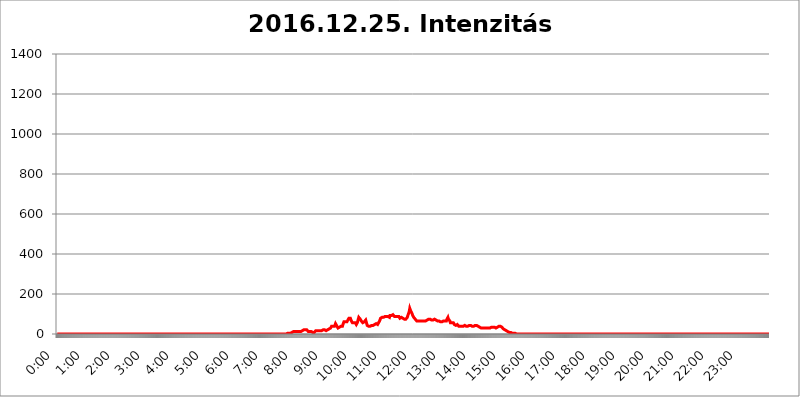
| Category | 2016.12.25. Intenzitás [W/m^2] |
|---|---|
| 0.0 | 0 |
| 0.0006944444444444445 | 0 |
| 0.001388888888888889 | 0 |
| 0.0020833333333333333 | 0 |
| 0.002777777777777778 | 0 |
| 0.003472222222222222 | 0 |
| 0.004166666666666667 | 0 |
| 0.004861111111111111 | 0 |
| 0.005555555555555556 | 0 |
| 0.0062499999999999995 | 0 |
| 0.006944444444444444 | 0 |
| 0.007638888888888889 | 0 |
| 0.008333333333333333 | 0 |
| 0.009027777777777779 | 0 |
| 0.009722222222222222 | 0 |
| 0.010416666666666666 | 0 |
| 0.011111111111111112 | 0 |
| 0.011805555555555555 | 0 |
| 0.012499999999999999 | 0 |
| 0.013194444444444444 | 0 |
| 0.013888888888888888 | 0 |
| 0.014583333333333332 | 0 |
| 0.015277777777777777 | 0 |
| 0.015972222222222224 | 0 |
| 0.016666666666666666 | 0 |
| 0.017361111111111112 | 0 |
| 0.018055555555555557 | 0 |
| 0.01875 | 0 |
| 0.019444444444444445 | 0 |
| 0.02013888888888889 | 0 |
| 0.020833333333333332 | 0 |
| 0.02152777777777778 | 0 |
| 0.022222222222222223 | 0 |
| 0.02291666666666667 | 0 |
| 0.02361111111111111 | 0 |
| 0.024305555555555556 | 0 |
| 0.024999999999999998 | 0 |
| 0.025694444444444447 | 0 |
| 0.02638888888888889 | 0 |
| 0.027083333333333334 | 0 |
| 0.027777777777777776 | 0 |
| 0.02847222222222222 | 0 |
| 0.029166666666666664 | 0 |
| 0.029861111111111113 | 0 |
| 0.030555555555555555 | 0 |
| 0.03125 | 0 |
| 0.03194444444444445 | 0 |
| 0.03263888888888889 | 0 |
| 0.03333333333333333 | 0 |
| 0.034027777777777775 | 0 |
| 0.034722222222222224 | 0 |
| 0.035416666666666666 | 0 |
| 0.036111111111111115 | 0 |
| 0.03680555555555556 | 0 |
| 0.0375 | 0 |
| 0.03819444444444444 | 0 |
| 0.03888888888888889 | 0 |
| 0.03958333333333333 | 0 |
| 0.04027777777777778 | 0 |
| 0.04097222222222222 | 0 |
| 0.041666666666666664 | 0 |
| 0.042361111111111106 | 0 |
| 0.04305555555555556 | 0 |
| 0.043750000000000004 | 0 |
| 0.044444444444444446 | 0 |
| 0.04513888888888889 | 0 |
| 0.04583333333333334 | 0 |
| 0.04652777777777778 | 0 |
| 0.04722222222222222 | 0 |
| 0.04791666666666666 | 0 |
| 0.04861111111111111 | 0 |
| 0.049305555555555554 | 0 |
| 0.049999999999999996 | 0 |
| 0.05069444444444445 | 0 |
| 0.051388888888888894 | 0 |
| 0.052083333333333336 | 0 |
| 0.05277777777777778 | 0 |
| 0.05347222222222222 | 0 |
| 0.05416666666666667 | 0 |
| 0.05486111111111111 | 0 |
| 0.05555555555555555 | 0 |
| 0.05625 | 0 |
| 0.05694444444444444 | 0 |
| 0.057638888888888885 | 0 |
| 0.05833333333333333 | 0 |
| 0.05902777777777778 | 0 |
| 0.059722222222222225 | 0 |
| 0.06041666666666667 | 0 |
| 0.061111111111111116 | 0 |
| 0.06180555555555556 | 0 |
| 0.0625 | 0 |
| 0.06319444444444444 | 0 |
| 0.06388888888888888 | 0 |
| 0.06458333333333334 | 0 |
| 0.06527777777777778 | 0 |
| 0.06597222222222222 | 0 |
| 0.06666666666666667 | 0 |
| 0.06736111111111111 | 0 |
| 0.06805555555555555 | 0 |
| 0.06874999999999999 | 0 |
| 0.06944444444444443 | 0 |
| 0.07013888888888889 | 0 |
| 0.07083333333333333 | 0 |
| 0.07152777777777779 | 0 |
| 0.07222222222222223 | 0 |
| 0.07291666666666667 | 0 |
| 0.07361111111111111 | 0 |
| 0.07430555555555556 | 0 |
| 0.075 | 0 |
| 0.07569444444444444 | 0 |
| 0.0763888888888889 | 0 |
| 0.07708333333333334 | 0 |
| 0.07777777777777778 | 0 |
| 0.07847222222222222 | 0 |
| 0.07916666666666666 | 0 |
| 0.0798611111111111 | 0 |
| 0.08055555555555556 | 0 |
| 0.08125 | 0 |
| 0.08194444444444444 | 0 |
| 0.08263888888888889 | 0 |
| 0.08333333333333333 | 0 |
| 0.08402777777777777 | 0 |
| 0.08472222222222221 | 0 |
| 0.08541666666666665 | 0 |
| 0.08611111111111112 | 0 |
| 0.08680555555555557 | 0 |
| 0.08750000000000001 | 0 |
| 0.08819444444444445 | 0 |
| 0.08888888888888889 | 0 |
| 0.08958333333333333 | 0 |
| 0.09027777777777778 | 0 |
| 0.09097222222222222 | 0 |
| 0.09166666666666667 | 0 |
| 0.09236111111111112 | 0 |
| 0.09305555555555556 | 0 |
| 0.09375 | 0 |
| 0.09444444444444444 | 0 |
| 0.09513888888888888 | 0 |
| 0.09583333333333333 | 0 |
| 0.09652777777777777 | 0 |
| 0.09722222222222222 | 0 |
| 0.09791666666666667 | 0 |
| 0.09861111111111111 | 0 |
| 0.09930555555555555 | 0 |
| 0.09999999999999999 | 0 |
| 0.10069444444444443 | 0 |
| 0.1013888888888889 | 0 |
| 0.10208333333333335 | 0 |
| 0.10277777777777779 | 0 |
| 0.10347222222222223 | 0 |
| 0.10416666666666667 | 0 |
| 0.10486111111111111 | 0 |
| 0.10555555555555556 | 0 |
| 0.10625 | 0 |
| 0.10694444444444444 | 0 |
| 0.1076388888888889 | 0 |
| 0.10833333333333334 | 0 |
| 0.10902777777777778 | 0 |
| 0.10972222222222222 | 0 |
| 0.1111111111111111 | 0 |
| 0.11180555555555556 | 0 |
| 0.11180555555555556 | 0 |
| 0.1125 | 0 |
| 0.11319444444444444 | 0 |
| 0.11388888888888889 | 0 |
| 0.11458333333333333 | 0 |
| 0.11527777777777777 | 0 |
| 0.11597222222222221 | 0 |
| 0.11666666666666665 | 0 |
| 0.1173611111111111 | 0 |
| 0.11805555555555557 | 0 |
| 0.11944444444444445 | 0 |
| 0.12013888888888889 | 0 |
| 0.12083333333333333 | 0 |
| 0.12152777777777778 | 0 |
| 0.12222222222222223 | 0 |
| 0.12291666666666667 | 0 |
| 0.12291666666666667 | 0 |
| 0.12361111111111112 | 0 |
| 0.12430555555555556 | 0 |
| 0.125 | 0 |
| 0.12569444444444444 | 0 |
| 0.12638888888888888 | 0 |
| 0.12708333333333333 | 0 |
| 0.16875 | 0 |
| 0.12847222222222224 | 0 |
| 0.12916666666666668 | 0 |
| 0.12986111111111112 | 0 |
| 0.13055555555555556 | 0 |
| 0.13125 | 0 |
| 0.13194444444444445 | 0 |
| 0.1326388888888889 | 0 |
| 0.13333333333333333 | 0 |
| 0.13402777777777777 | 0 |
| 0.13402777777777777 | 0 |
| 0.13472222222222222 | 0 |
| 0.13541666666666666 | 0 |
| 0.1361111111111111 | 0 |
| 0.13749999999999998 | 0 |
| 0.13819444444444443 | 0 |
| 0.1388888888888889 | 0 |
| 0.13958333333333334 | 0 |
| 0.14027777777777778 | 0 |
| 0.14097222222222222 | 0 |
| 0.14166666666666666 | 0 |
| 0.1423611111111111 | 0 |
| 0.14305555555555557 | 0 |
| 0.14375000000000002 | 0 |
| 0.14444444444444446 | 0 |
| 0.1451388888888889 | 0 |
| 0.1451388888888889 | 0 |
| 0.14652777777777778 | 0 |
| 0.14722222222222223 | 0 |
| 0.14791666666666667 | 0 |
| 0.1486111111111111 | 0 |
| 0.14930555555555555 | 0 |
| 0.15 | 0 |
| 0.15069444444444444 | 0 |
| 0.15138888888888888 | 0 |
| 0.15208333333333332 | 0 |
| 0.15277777777777776 | 0 |
| 0.15347222222222223 | 0 |
| 0.15416666666666667 | 0 |
| 0.15486111111111112 | 0 |
| 0.15555555555555556 | 0 |
| 0.15625 | 0 |
| 0.15694444444444444 | 0 |
| 0.15763888888888888 | 0 |
| 0.15833333333333333 | 0 |
| 0.15902777777777777 | 0 |
| 0.15972222222222224 | 0 |
| 0.16041666666666668 | 0 |
| 0.16111111111111112 | 0 |
| 0.16180555555555556 | 0 |
| 0.1625 | 0 |
| 0.16319444444444445 | 0 |
| 0.1638888888888889 | 0 |
| 0.16458333333333333 | 0 |
| 0.16527777777777777 | 0 |
| 0.16597222222222222 | 0 |
| 0.16666666666666666 | 0 |
| 0.1673611111111111 | 0 |
| 0.16805555555555554 | 0 |
| 0.16874999999999998 | 0 |
| 0.16944444444444443 | 0 |
| 0.17013888888888887 | 0 |
| 0.1708333333333333 | 0 |
| 0.17152777777777775 | 0 |
| 0.17222222222222225 | 0 |
| 0.1729166666666667 | 0 |
| 0.17361111111111113 | 0 |
| 0.17430555555555557 | 0 |
| 0.17500000000000002 | 0 |
| 0.17569444444444446 | 0 |
| 0.1763888888888889 | 0 |
| 0.17708333333333334 | 0 |
| 0.17777777777777778 | 0 |
| 0.17847222222222223 | 0 |
| 0.17916666666666667 | 0 |
| 0.1798611111111111 | 0 |
| 0.18055555555555555 | 0 |
| 0.18125 | 0 |
| 0.18194444444444444 | 0 |
| 0.1826388888888889 | 0 |
| 0.18333333333333335 | 0 |
| 0.1840277777777778 | 0 |
| 0.18472222222222223 | 0 |
| 0.18541666666666667 | 0 |
| 0.18611111111111112 | 0 |
| 0.18680555555555556 | 0 |
| 0.1875 | 0 |
| 0.18819444444444444 | 0 |
| 0.18888888888888888 | 0 |
| 0.18958333333333333 | 0 |
| 0.19027777777777777 | 0 |
| 0.1909722222222222 | 0 |
| 0.19166666666666665 | 0 |
| 0.19236111111111112 | 0 |
| 0.19305555555555554 | 0 |
| 0.19375 | 0 |
| 0.19444444444444445 | 0 |
| 0.1951388888888889 | 0 |
| 0.19583333333333333 | 0 |
| 0.19652777777777777 | 0 |
| 0.19722222222222222 | 0 |
| 0.19791666666666666 | 0 |
| 0.1986111111111111 | 0 |
| 0.19930555555555554 | 0 |
| 0.19999999999999998 | 0 |
| 0.20069444444444443 | 0 |
| 0.20138888888888887 | 0 |
| 0.2020833333333333 | 0 |
| 0.2027777777777778 | 0 |
| 0.2034722222222222 | 0 |
| 0.2041666666666667 | 0 |
| 0.20486111111111113 | 0 |
| 0.20555555555555557 | 0 |
| 0.20625000000000002 | 0 |
| 0.20694444444444446 | 0 |
| 0.2076388888888889 | 0 |
| 0.20833333333333334 | 0 |
| 0.20902777777777778 | 0 |
| 0.20972222222222223 | 0 |
| 0.21041666666666667 | 0 |
| 0.2111111111111111 | 0 |
| 0.21180555555555555 | 0 |
| 0.2125 | 0 |
| 0.21319444444444444 | 0 |
| 0.2138888888888889 | 0 |
| 0.21458333333333335 | 0 |
| 0.2152777777777778 | 0 |
| 0.21597222222222223 | 0 |
| 0.21666666666666667 | 0 |
| 0.21736111111111112 | 0 |
| 0.21805555555555556 | 0 |
| 0.21875 | 0 |
| 0.21944444444444444 | 0 |
| 0.22013888888888888 | 0 |
| 0.22083333333333333 | 0 |
| 0.22152777777777777 | 0 |
| 0.2222222222222222 | 0 |
| 0.22291666666666665 | 0 |
| 0.2236111111111111 | 0 |
| 0.22430555555555556 | 0 |
| 0.225 | 0 |
| 0.22569444444444445 | 0 |
| 0.2263888888888889 | 0 |
| 0.22708333333333333 | 0 |
| 0.22777777777777777 | 0 |
| 0.22847222222222222 | 0 |
| 0.22916666666666666 | 0 |
| 0.2298611111111111 | 0 |
| 0.23055555555555554 | 0 |
| 0.23124999999999998 | 0 |
| 0.23194444444444443 | 0 |
| 0.23263888888888887 | 0 |
| 0.2333333333333333 | 0 |
| 0.2340277777777778 | 0 |
| 0.2347222222222222 | 0 |
| 0.2354166666666667 | 0 |
| 0.23611111111111113 | 0 |
| 0.23680555555555557 | 0 |
| 0.23750000000000002 | 0 |
| 0.23819444444444446 | 0 |
| 0.2388888888888889 | 0 |
| 0.23958333333333334 | 0 |
| 0.24027777777777778 | 0 |
| 0.24097222222222223 | 0 |
| 0.24166666666666667 | 0 |
| 0.2423611111111111 | 0 |
| 0.24305555555555555 | 0 |
| 0.24375 | 0 |
| 0.24444444444444446 | 0 |
| 0.24513888888888888 | 0 |
| 0.24583333333333335 | 0 |
| 0.2465277777777778 | 0 |
| 0.24722222222222223 | 0 |
| 0.24791666666666667 | 0 |
| 0.24861111111111112 | 0 |
| 0.24930555555555556 | 0 |
| 0.25 | 0 |
| 0.25069444444444444 | 0 |
| 0.2513888888888889 | 0 |
| 0.2520833333333333 | 0 |
| 0.25277777777777777 | 0 |
| 0.2534722222222222 | 0 |
| 0.25416666666666665 | 0 |
| 0.2548611111111111 | 0 |
| 0.2555555555555556 | 0 |
| 0.25625000000000003 | 0 |
| 0.2569444444444445 | 0 |
| 0.2576388888888889 | 0 |
| 0.25833333333333336 | 0 |
| 0.2590277777777778 | 0 |
| 0.25972222222222224 | 0 |
| 0.2604166666666667 | 0 |
| 0.2611111111111111 | 0 |
| 0.26180555555555557 | 0 |
| 0.2625 | 0 |
| 0.26319444444444445 | 0 |
| 0.2638888888888889 | 0 |
| 0.26458333333333334 | 0 |
| 0.2652777777777778 | 0 |
| 0.2659722222222222 | 0 |
| 0.26666666666666666 | 0 |
| 0.2673611111111111 | 0 |
| 0.26805555555555555 | 0 |
| 0.26875 | 0 |
| 0.26944444444444443 | 0 |
| 0.2701388888888889 | 0 |
| 0.2708333333333333 | 0 |
| 0.27152777777777776 | 0 |
| 0.2722222222222222 | 0 |
| 0.27291666666666664 | 0 |
| 0.2736111111111111 | 0 |
| 0.2743055555555555 | 0 |
| 0.27499999999999997 | 0 |
| 0.27569444444444446 | 0 |
| 0.27638888888888885 | 0 |
| 0.27708333333333335 | 0 |
| 0.2777777777777778 | 0 |
| 0.27847222222222223 | 0 |
| 0.2791666666666667 | 0 |
| 0.2798611111111111 | 0 |
| 0.28055555555555556 | 0 |
| 0.28125 | 0 |
| 0.28194444444444444 | 0 |
| 0.2826388888888889 | 0 |
| 0.2833333333333333 | 0 |
| 0.28402777777777777 | 0 |
| 0.2847222222222222 | 0 |
| 0.28541666666666665 | 0 |
| 0.28611111111111115 | 0 |
| 0.28680555555555554 | 0 |
| 0.28750000000000003 | 0 |
| 0.2881944444444445 | 0 |
| 0.2888888888888889 | 0 |
| 0.28958333333333336 | 0 |
| 0.2902777777777778 | 0 |
| 0.29097222222222224 | 0 |
| 0.2916666666666667 | 0 |
| 0.2923611111111111 | 0 |
| 0.29305555555555557 | 0 |
| 0.29375 | 0 |
| 0.29444444444444445 | 0 |
| 0.2951388888888889 | 0 |
| 0.29583333333333334 | 0 |
| 0.2965277777777778 | 0 |
| 0.2972222222222222 | 0 |
| 0.29791666666666666 | 0 |
| 0.2986111111111111 | 0 |
| 0.29930555555555555 | 0 |
| 0.3 | 0 |
| 0.30069444444444443 | 0 |
| 0.3013888888888889 | 0 |
| 0.3020833333333333 | 0 |
| 0.30277777777777776 | 0 |
| 0.3034722222222222 | 0 |
| 0.30416666666666664 | 0 |
| 0.3048611111111111 | 0 |
| 0.3055555555555555 | 0 |
| 0.30624999999999997 | 0 |
| 0.3069444444444444 | 0 |
| 0.3076388888888889 | 0 |
| 0.30833333333333335 | 0 |
| 0.3090277777777778 | 0 |
| 0.30972222222222223 | 0 |
| 0.3104166666666667 | 0 |
| 0.3111111111111111 | 0 |
| 0.31180555555555556 | 0 |
| 0.3125 | 0 |
| 0.31319444444444444 | 0 |
| 0.3138888888888889 | 0 |
| 0.3145833333333333 | 0 |
| 0.31527777777777777 | 0 |
| 0.3159722222222222 | 0 |
| 0.31666666666666665 | 0 |
| 0.31736111111111115 | 0 |
| 0.31805555555555554 | 0 |
| 0.31875000000000003 | 0 |
| 0.3194444444444445 | 0 |
| 0.3201388888888889 | 0 |
| 0.32083333333333336 | 0 |
| 0.3215277777777778 | 3.525 |
| 0.32222222222222224 | 3.525 |
| 0.3229166666666667 | 3.525 |
| 0.3236111111111111 | 3.525 |
| 0.32430555555555557 | 3.525 |
| 0.325 | 3.525 |
| 0.32569444444444445 | 3.525 |
| 0.3263888888888889 | 3.525 |
| 0.32708333333333334 | 3.525 |
| 0.3277777777777778 | 7.887 |
| 0.3284722222222222 | 7.887 |
| 0.32916666666666666 | 7.887 |
| 0.3298611111111111 | 7.887 |
| 0.33055555555555555 | 7.887 |
| 0.33125 | 12.257 |
| 0.33194444444444443 | 12.257 |
| 0.3326388888888889 | 12.257 |
| 0.3333333333333333 | 12.257 |
| 0.3340277777777778 | 12.257 |
| 0.3347222222222222 | 12.257 |
| 0.3354166666666667 | 12.257 |
| 0.3361111111111111 | 12.257 |
| 0.3368055555555556 | 12.257 |
| 0.33749999999999997 | 12.257 |
| 0.33819444444444446 | 12.257 |
| 0.33888888888888885 | 12.257 |
| 0.33958333333333335 | 12.257 |
| 0.34027777777777773 | 12.257 |
| 0.34097222222222223 | 12.257 |
| 0.3416666666666666 | 12.257 |
| 0.3423611111111111 | 16.636 |
| 0.3430555555555555 | 16.636 |
| 0.34375 | 16.636 |
| 0.3444444444444445 | 16.636 |
| 0.3451388888888889 | 16.636 |
| 0.3458333333333334 | 21.024 |
| 0.34652777777777777 | 21.024 |
| 0.34722222222222227 | 21.024 |
| 0.34791666666666665 | 21.024 |
| 0.34861111111111115 | 21.024 |
| 0.34930555555555554 | 21.024 |
| 0.35000000000000003 | 21.024 |
| 0.3506944444444444 | 21.024 |
| 0.3513888888888889 | 16.636 |
| 0.3520833333333333 | 12.257 |
| 0.3527777777777778 | 12.257 |
| 0.3534722222222222 | 12.257 |
| 0.3541666666666667 | 12.257 |
| 0.3548611111111111 | 12.257 |
| 0.35555555555555557 | 12.257 |
| 0.35625 | 12.257 |
| 0.35694444444444445 | 12.257 |
| 0.3576388888888889 | 12.257 |
| 0.35833333333333334 | 7.887 |
| 0.3590277777777778 | 7.887 |
| 0.3597222222222222 | 7.887 |
| 0.36041666666666666 | 7.887 |
| 0.3611111111111111 | 12.257 |
| 0.36180555555555555 | 12.257 |
| 0.3625 | 16.636 |
| 0.36319444444444443 | 16.636 |
| 0.3638888888888889 | 16.636 |
| 0.3645833333333333 | 16.636 |
| 0.3652777777777778 | 16.636 |
| 0.3659722222222222 | 16.636 |
| 0.3666666666666667 | 16.636 |
| 0.3673611111111111 | 16.636 |
| 0.3680555555555556 | 16.636 |
| 0.36874999999999997 | 16.636 |
| 0.36944444444444446 | 16.636 |
| 0.37013888888888885 | 16.636 |
| 0.37083333333333335 | 16.636 |
| 0.37152777777777773 | 21.024 |
| 0.37222222222222223 | 21.024 |
| 0.3729166666666666 | 21.024 |
| 0.3736111111111111 | 16.636 |
| 0.3743055555555555 | 21.024 |
| 0.375 | 21.024 |
| 0.3756944444444445 | 16.636 |
| 0.3763888888888889 | 21.024 |
| 0.3770833333333334 | 16.636 |
| 0.37777777777777777 | 16.636 |
| 0.37847222222222227 | 21.024 |
| 0.37916666666666665 | 21.024 |
| 0.37986111111111115 | 25.419 |
| 0.38055555555555554 | 25.419 |
| 0.38125000000000003 | 25.419 |
| 0.3819444444444444 | 29.823 |
| 0.3826388888888889 | 29.823 |
| 0.3833333333333333 | 29.823 |
| 0.3840277777777778 | 34.234 |
| 0.3847222222222222 | 38.653 |
| 0.3854166666666667 | 43.079 |
| 0.3861111111111111 | 38.653 |
| 0.38680555555555557 | 38.653 |
| 0.3875 | 34.234 |
| 0.38819444444444445 | 34.234 |
| 0.3888888888888889 | 38.653 |
| 0.38958333333333334 | 43.079 |
| 0.3902777777777778 | 51.951 |
| 0.3909722222222222 | 51.951 |
| 0.39166666666666666 | 47.511 |
| 0.3923611111111111 | 38.653 |
| 0.39305555555555555 | 34.234 |
| 0.39375 | 29.823 |
| 0.39444444444444443 | 29.823 |
| 0.3951388888888889 | 29.823 |
| 0.3958333333333333 | 34.234 |
| 0.3965277777777778 | 38.653 |
| 0.3972222222222222 | 38.653 |
| 0.3979166666666667 | 38.653 |
| 0.3986111111111111 | 38.653 |
| 0.3993055555555556 | 38.653 |
| 0.39999999999999997 | 38.653 |
| 0.40069444444444446 | 47.511 |
| 0.40138888888888885 | 51.951 |
| 0.40208333333333335 | 60.85 |
| 0.40277777777777773 | 65.31 |
| 0.40347222222222223 | 65.31 |
| 0.4041666666666666 | 60.85 |
| 0.4048611111111111 | 60.85 |
| 0.4055555555555555 | 65.31 |
| 0.40625 | 60.85 |
| 0.4069444444444445 | 65.31 |
| 0.4076388888888889 | 69.775 |
| 0.4083333333333334 | 74.246 |
| 0.40902777777777777 | 78.722 |
| 0.40972222222222227 | 78.722 |
| 0.41041666666666665 | 83.205 |
| 0.41111111111111115 | 78.722 |
| 0.41180555555555554 | 78.722 |
| 0.41250000000000003 | 65.31 |
| 0.4131944444444444 | 60.85 |
| 0.4138888888888889 | 56.398 |
| 0.4145833333333333 | 56.398 |
| 0.4152777777777778 | 56.398 |
| 0.4159722222222222 | 56.398 |
| 0.4166666666666667 | 56.398 |
| 0.4173611111111111 | 51.951 |
| 0.41805555555555557 | 56.398 |
| 0.41875 | 51.951 |
| 0.41944444444444445 | 47.511 |
| 0.4201388888888889 | 51.951 |
| 0.42083333333333334 | 56.398 |
| 0.4215277777777778 | 60.85 |
| 0.4222222222222222 | 74.246 |
| 0.42291666666666666 | 83.205 |
| 0.4236111111111111 | 83.205 |
| 0.42430555555555555 | 83.205 |
| 0.425 | 74.246 |
| 0.42569444444444443 | 69.775 |
| 0.4263888888888889 | 65.31 |
| 0.4270833333333333 | 60.85 |
| 0.4277777777777778 | 60.85 |
| 0.4284722222222222 | 56.398 |
| 0.4291666666666667 | 60.85 |
| 0.4298611111111111 | 60.85 |
| 0.4305555555555556 | 60.85 |
| 0.43124999999999997 | 60.85 |
| 0.43194444444444446 | 65.31 |
| 0.43263888888888885 | 69.775 |
| 0.43333333333333335 | 60.85 |
| 0.43402777777777773 | 51.951 |
| 0.43472222222222223 | 43.079 |
| 0.4354166666666666 | 43.079 |
| 0.4361111111111111 | 38.653 |
| 0.4368055555555555 | 38.653 |
| 0.4375 | 38.653 |
| 0.4381944444444445 | 38.653 |
| 0.4388888888888889 | 38.653 |
| 0.4395833333333334 | 38.653 |
| 0.44027777777777777 | 38.653 |
| 0.44097222222222227 | 43.079 |
| 0.44166666666666665 | 43.079 |
| 0.44236111111111115 | 43.079 |
| 0.44305555555555554 | 43.079 |
| 0.44375000000000003 | 43.079 |
| 0.4444444444444444 | 47.511 |
| 0.4451388888888889 | 47.511 |
| 0.4458333333333333 | 51.951 |
| 0.4465277777777778 | 47.511 |
| 0.4472222222222222 | 51.951 |
| 0.4479166666666667 | 47.511 |
| 0.4486111111111111 | 47.511 |
| 0.44930555555555557 | 47.511 |
| 0.45 | 47.511 |
| 0.45069444444444445 | 56.398 |
| 0.4513888888888889 | 60.85 |
| 0.45208333333333334 | 65.31 |
| 0.4527777777777778 | 69.775 |
| 0.4534722222222222 | 78.722 |
| 0.45416666666666666 | 83.205 |
| 0.4548611111111111 | 83.205 |
| 0.45555555555555555 | 83.205 |
| 0.45625 | 78.722 |
| 0.45694444444444443 | 78.722 |
| 0.4576388888888889 | 83.205 |
| 0.4583333333333333 | 83.205 |
| 0.4590277777777778 | 87.692 |
| 0.4597222222222222 | 87.692 |
| 0.4604166666666667 | 87.692 |
| 0.4611111111111111 | 87.692 |
| 0.4618055555555556 | 87.692 |
| 0.46249999999999997 | 87.692 |
| 0.46319444444444446 | 87.692 |
| 0.46388888888888885 | 87.692 |
| 0.46458333333333335 | 83.205 |
| 0.46527777777777773 | 83.205 |
| 0.46597222222222223 | 83.205 |
| 0.4666666666666666 | 92.184 |
| 0.4673611111111111 | 92.184 |
| 0.4680555555555555 | 92.184 |
| 0.46875 | 92.184 |
| 0.4694444444444445 | 92.184 |
| 0.4701388888888889 | 96.682 |
| 0.4708333333333334 | 96.682 |
| 0.47152777777777777 | 92.184 |
| 0.47222222222222227 | 92.184 |
| 0.47291666666666665 | 87.692 |
| 0.47361111111111115 | 87.692 |
| 0.47430555555555554 | 87.692 |
| 0.47500000000000003 | 87.692 |
| 0.4756944444444444 | 87.692 |
| 0.4763888888888889 | 87.692 |
| 0.4770833333333333 | 87.692 |
| 0.4777777777777778 | 83.205 |
| 0.4784722222222222 | 87.692 |
| 0.4791666666666667 | 87.692 |
| 0.4798611111111111 | 83.205 |
| 0.48055555555555557 | 78.722 |
| 0.48125 | 78.722 |
| 0.48194444444444445 | 83.205 |
| 0.4826388888888889 | 83.205 |
| 0.48333333333333334 | 83.205 |
| 0.4840277777777778 | 78.722 |
| 0.4847222222222222 | 78.722 |
| 0.48541666666666666 | 74.246 |
| 0.4861111111111111 | 74.246 |
| 0.48680555555555555 | 74.246 |
| 0.4875 | 69.775 |
| 0.48819444444444443 | 74.246 |
| 0.4888888888888889 | 74.246 |
| 0.4895833333333333 | 74.246 |
| 0.4902777777777778 | 78.722 |
| 0.4909722222222222 | 83.205 |
| 0.4916666666666667 | 92.184 |
| 0.4923611111111111 | 96.682 |
| 0.4930555555555556 | 105.69 |
| 0.49374999999999997 | 114.716 |
| 0.49444444444444446 | 128.284 |
| 0.49513888888888885 | 123.758 |
| 0.49583333333333335 | 114.716 |
| 0.49652777777777773 | 110.201 |
| 0.49722222222222223 | 105.69 |
| 0.4979166666666666 | 101.184 |
| 0.4986111111111111 | 92.184 |
| 0.4993055555555555 | 87.692 |
| 0.5 | 83.205 |
| 0.5006944444444444 | 83.205 |
| 0.5013888888888889 | 78.722 |
| 0.5020833333333333 | 74.246 |
| 0.5027777777777778 | 74.246 |
| 0.5034722222222222 | 69.775 |
| 0.5041666666666667 | 65.31 |
| 0.5048611111111111 | 65.31 |
| 0.5055555555555555 | 65.31 |
| 0.50625 | 65.31 |
| 0.5069444444444444 | 65.31 |
| 0.5076388888888889 | 65.31 |
| 0.5083333333333333 | 65.31 |
| 0.5090277777777777 | 65.31 |
| 0.5097222222222222 | 65.31 |
| 0.5104166666666666 | 65.31 |
| 0.5111111111111112 | 60.85 |
| 0.5118055555555555 | 65.31 |
| 0.5125000000000001 | 65.31 |
| 0.5131944444444444 | 65.31 |
| 0.513888888888889 | 65.31 |
| 0.5145833333333333 | 65.31 |
| 0.5152777777777778 | 65.31 |
| 0.5159722222222222 | 65.31 |
| 0.5166666666666667 | 65.31 |
| 0.517361111111111 | 65.31 |
| 0.5180555555555556 | 69.775 |
| 0.5187499999999999 | 69.775 |
| 0.5194444444444445 | 69.775 |
| 0.5201388888888888 | 69.775 |
| 0.5208333333333334 | 74.246 |
| 0.5215277777777778 | 74.246 |
| 0.5222222222222223 | 74.246 |
| 0.5229166666666667 | 74.246 |
| 0.5236111111111111 | 74.246 |
| 0.5243055555555556 | 69.775 |
| 0.525 | 69.775 |
| 0.5256944444444445 | 65.31 |
| 0.5263888888888889 | 69.775 |
| 0.5270833333333333 | 69.775 |
| 0.5277777777777778 | 69.775 |
| 0.5284722222222222 | 69.775 |
| 0.5291666666666667 | 74.246 |
| 0.5298611111111111 | 74.246 |
| 0.5305555555555556 | 69.775 |
| 0.53125 | 69.775 |
| 0.5319444444444444 | 69.775 |
| 0.5326388888888889 | 69.775 |
| 0.5333333333333333 | 65.31 |
| 0.5340277777777778 | 65.31 |
| 0.5347222222222222 | 65.31 |
| 0.5354166666666667 | 65.31 |
| 0.5361111111111111 | 60.85 |
| 0.5368055555555555 | 60.85 |
| 0.5375 | 60.85 |
| 0.5381944444444444 | 60.85 |
| 0.5388888888888889 | 60.85 |
| 0.5395833333333333 | 60.85 |
| 0.5402777777777777 | 60.85 |
| 0.5409722222222222 | 65.31 |
| 0.5416666666666666 | 65.31 |
| 0.5423611111111112 | 65.31 |
| 0.5430555555555555 | 65.31 |
| 0.5437500000000001 | 65.31 |
| 0.5444444444444444 | 65.31 |
| 0.545138888888889 | 60.85 |
| 0.5458333333333333 | 65.31 |
| 0.5465277777777778 | 74.246 |
| 0.5472222222222222 | 78.722 |
| 0.5479166666666667 | 83.205 |
| 0.548611111111111 | 74.246 |
| 0.5493055555555556 | 74.246 |
| 0.5499999999999999 | 69.775 |
| 0.5506944444444445 | 65.31 |
| 0.5513888888888888 | 56.398 |
| 0.5520833333333334 | 51.951 |
| 0.5527777777777778 | 51.951 |
| 0.5534722222222223 | 56.398 |
| 0.5541666666666667 | 51.951 |
| 0.5548611111111111 | 56.398 |
| 0.5555555555555556 | 56.398 |
| 0.55625 | 51.951 |
| 0.5569444444444445 | 47.511 |
| 0.5576388888888889 | 47.511 |
| 0.5583333333333333 | 47.511 |
| 0.5590277777777778 | 43.079 |
| 0.5597222222222222 | 47.511 |
| 0.5604166666666667 | 47.511 |
| 0.5611111111111111 | 47.511 |
| 0.5618055555555556 | 47.511 |
| 0.5625 | 43.079 |
| 0.5631944444444444 | 38.653 |
| 0.5638888888888889 | 38.653 |
| 0.5645833333333333 | 38.653 |
| 0.5652777777777778 | 38.653 |
| 0.5659722222222222 | 38.653 |
| 0.5666666666666667 | 38.653 |
| 0.5673611111111111 | 38.653 |
| 0.5680555555555555 | 38.653 |
| 0.56875 | 38.653 |
| 0.5694444444444444 | 38.653 |
| 0.5701388888888889 | 38.653 |
| 0.5708333333333333 | 38.653 |
| 0.5715277777777777 | 43.079 |
| 0.5722222222222222 | 38.653 |
| 0.5729166666666666 | 38.653 |
| 0.5736111111111112 | 38.653 |
| 0.5743055555555555 | 43.079 |
| 0.5750000000000001 | 38.653 |
| 0.5756944444444444 | 38.653 |
| 0.576388888888889 | 43.079 |
| 0.5770833333333333 | 43.079 |
| 0.5777777777777778 | 43.079 |
| 0.5784722222222222 | 43.079 |
| 0.5791666666666667 | 43.079 |
| 0.579861111111111 | 43.079 |
| 0.5805555555555556 | 43.079 |
| 0.5812499999999999 | 43.079 |
| 0.5819444444444445 | 38.653 |
| 0.5826388888888888 | 38.653 |
| 0.5833333333333334 | 38.653 |
| 0.5840277777777778 | 38.653 |
| 0.5847222222222223 | 43.079 |
| 0.5854166666666667 | 43.079 |
| 0.5861111111111111 | 43.079 |
| 0.5868055555555556 | 43.079 |
| 0.5875 | 43.079 |
| 0.5881944444444445 | 43.079 |
| 0.5888888888888889 | 43.079 |
| 0.5895833333333333 | 38.653 |
| 0.5902777777777778 | 38.653 |
| 0.5909722222222222 | 38.653 |
| 0.5916666666666667 | 38.653 |
| 0.5923611111111111 | 34.234 |
| 0.5930555555555556 | 34.234 |
| 0.59375 | 29.823 |
| 0.5944444444444444 | 29.823 |
| 0.5951388888888889 | 29.823 |
| 0.5958333333333333 | 29.823 |
| 0.5965277777777778 | 29.823 |
| 0.5972222222222222 | 29.823 |
| 0.5979166666666667 | 29.823 |
| 0.5986111111111111 | 29.823 |
| 0.5993055555555555 | 29.823 |
| 0.6 | 29.823 |
| 0.6006944444444444 | 29.823 |
| 0.6013888888888889 | 29.823 |
| 0.6020833333333333 | 29.823 |
| 0.6027777777777777 | 29.823 |
| 0.6034722222222222 | 29.823 |
| 0.6041666666666666 | 29.823 |
| 0.6048611111111112 | 29.823 |
| 0.6055555555555555 | 29.823 |
| 0.6062500000000001 | 29.823 |
| 0.6069444444444444 | 29.823 |
| 0.607638888888889 | 29.823 |
| 0.6083333333333333 | 34.234 |
| 0.6090277777777778 | 34.234 |
| 0.6097222222222222 | 34.234 |
| 0.6104166666666667 | 34.234 |
| 0.611111111111111 | 34.234 |
| 0.6118055555555556 | 34.234 |
| 0.6124999999999999 | 34.234 |
| 0.6131944444444445 | 34.234 |
| 0.6138888888888888 | 29.823 |
| 0.6145833333333334 | 29.823 |
| 0.6152777777777778 | 29.823 |
| 0.6159722222222223 | 29.823 |
| 0.6166666666666667 | 34.234 |
| 0.6173611111111111 | 34.234 |
| 0.6180555555555556 | 34.234 |
| 0.61875 | 38.653 |
| 0.6194444444444445 | 38.653 |
| 0.6201388888888889 | 38.653 |
| 0.6208333333333333 | 38.653 |
| 0.6215277777777778 | 38.653 |
| 0.6222222222222222 | 38.653 |
| 0.6229166666666667 | 34.234 |
| 0.6236111111111111 | 34.234 |
| 0.6243055555555556 | 29.823 |
| 0.625 | 29.823 |
| 0.6256944444444444 | 25.419 |
| 0.6263888888888889 | 25.419 |
| 0.6270833333333333 | 21.024 |
| 0.6277777777777778 | 21.024 |
| 0.6284722222222222 | 21.024 |
| 0.6291666666666667 | 16.636 |
| 0.6298611111111111 | 16.636 |
| 0.6305555555555555 | 16.636 |
| 0.63125 | 12.257 |
| 0.6319444444444444 | 12.257 |
| 0.6326388888888889 | 12.257 |
| 0.6333333333333333 | 7.887 |
| 0.6340277777777777 | 7.887 |
| 0.6347222222222222 | 7.887 |
| 0.6354166666666666 | 7.887 |
| 0.6361111111111112 | 7.887 |
| 0.6368055555555555 | 7.887 |
| 0.6375000000000001 | 3.525 |
| 0.6381944444444444 | 3.525 |
| 0.638888888888889 | 3.525 |
| 0.6395833333333333 | 3.525 |
| 0.6402777777777778 | 3.525 |
| 0.6409722222222222 | 3.525 |
| 0.6416666666666667 | 3.525 |
| 0.642361111111111 | 3.525 |
| 0.6430555555555556 | 3.525 |
| 0.6437499999999999 | 3.525 |
| 0.6444444444444445 | 0 |
| 0.6451388888888888 | 0 |
| 0.6458333333333334 | 0 |
| 0.6465277777777778 | 0 |
| 0.6472222222222223 | 0 |
| 0.6479166666666667 | 0 |
| 0.6486111111111111 | 0 |
| 0.6493055555555556 | 0 |
| 0.65 | 0 |
| 0.6506944444444445 | 0 |
| 0.6513888888888889 | 0 |
| 0.6520833333333333 | 0 |
| 0.6527777777777778 | 0 |
| 0.6534722222222222 | 0 |
| 0.6541666666666667 | 0 |
| 0.6548611111111111 | 0 |
| 0.6555555555555556 | 0 |
| 0.65625 | 0 |
| 0.6569444444444444 | 0 |
| 0.6576388888888889 | 0 |
| 0.6583333333333333 | 0 |
| 0.6590277777777778 | 0 |
| 0.6597222222222222 | 0 |
| 0.6604166666666667 | 0 |
| 0.6611111111111111 | 0 |
| 0.6618055555555555 | 0 |
| 0.6625 | 0 |
| 0.6631944444444444 | 0 |
| 0.6638888888888889 | 0 |
| 0.6645833333333333 | 0 |
| 0.6652777777777777 | 0 |
| 0.6659722222222222 | 0 |
| 0.6666666666666666 | 0 |
| 0.6673611111111111 | 0 |
| 0.6680555555555556 | 0 |
| 0.6687500000000001 | 0 |
| 0.6694444444444444 | 0 |
| 0.6701388888888888 | 0 |
| 0.6708333333333334 | 0 |
| 0.6715277777777778 | 0 |
| 0.6722222222222222 | 0 |
| 0.6729166666666666 | 0 |
| 0.6736111111111112 | 0 |
| 0.6743055555555556 | 0 |
| 0.6749999999999999 | 0 |
| 0.6756944444444444 | 0 |
| 0.6763888888888889 | 0 |
| 0.6770833333333334 | 0 |
| 0.6777777777777777 | 0 |
| 0.6784722222222223 | 0 |
| 0.6791666666666667 | 0 |
| 0.6798611111111111 | 0 |
| 0.6805555555555555 | 0 |
| 0.68125 | 0 |
| 0.6819444444444445 | 0 |
| 0.6826388888888889 | 0 |
| 0.6833333333333332 | 0 |
| 0.6840277777777778 | 0 |
| 0.6847222222222222 | 0 |
| 0.6854166666666667 | 0 |
| 0.686111111111111 | 0 |
| 0.6868055555555556 | 0 |
| 0.6875 | 0 |
| 0.6881944444444444 | 0 |
| 0.688888888888889 | 0 |
| 0.6895833333333333 | 0 |
| 0.6902777777777778 | 0 |
| 0.6909722222222222 | 0 |
| 0.6916666666666668 | 0 |
| 0.6923611111111111 | 0 |
| 0.6930555555555555 | 0 |
| 0.69375 | 0 |
| 0.6944444444444445 | 0 |
| 0.6951388888888889 | 0 |
| 0.6958333333333333 | 0 |
| 0.6965277777777777 | 0 |
| 0.6972222222222223 | 0 |
| 0.6979166666666666 | 0 |
| 0.6986111111111111 | 0 |
| 0.6993055555555556 | 0 |
| 0.7000000000000001 | 0 |
| 0.7006944444444444 | 0 |
| 0.7013888888888888 | 0 |
| 0.7020833333333334 | 0 |
| 0.7027777777777778 | 0 |
| 0.7034722222222222 | 0 |
| 0.7041666666666666 | 0 |
| 0.7048611111111112 | 0 |
| 0.7055555555555556 | 0 |
| 0.7062499999999999 | 0 |
| 0.7069444444444444 | 0 |
| 0.7076388888888889 | 0 |
| 0.7083333333333334 | 0 |
| 0.7090277777777777 | 0 |
| 0.7097222222222223 | 0 |
| 0.7104166666666667 | 0 |
| 0.7111111111111111 | 0 |
| 0.7118055555555555 | 0 |
| 0.7125 | 0 |
| 0.7131944444444445 | 0 |
| 0.7138888888888889 | 0 |
| 0.7145833333333332 | 0 |
| 0.7152777777777778 | 0 |
| 0.7159722222222222 | 0 |
| 0.7166666666666667 | 0 |
| 0.717361111111111 | 0 |
| 0.7180555555555556 | 0 |
| 0.71875 | 0 |
| 0.7194444444444444 | 0 |
| 0.720138888888889 | 0 |
| 0.7208333333333333 | 0 |
| 0.7215277777777778 | 0 |
| 0.7222222222222222 | 0 |
| 0.7229166666666668 | 0 |
| 0.7236111111111111 | 0 |
| 0.7243055555555555 | 0 |
| 0.725 | 0 |
| 0.7256944444444445 | 0 |
| 0.7263888888888889 | 0 |
| 0.7270833333333333 | 0 |
| 0.7277777777777777 | 0 |
| 0.7284722222222223 | 0 |
| 0.7291666666666666 | 0 |
| 0.7298611111111111 | 0 |
| 0.7305555555555556 | 0 |
| 0.7312500000000001 | 0 |
| 0.7319444444444444 | 0 |
| 0.7326388888888888 | 0 |
| 0.7333333333333334 | 0 |
| 0.7340277777777778 | 0 |
| 0.7347222222222222 | 0 |
| 0.7354166666666666 | 0 |
| 0.7361111111111112 | 0 |
| 0.7368055555555556 | 0 |
| 0.7374999999999999 | 0 |
| 0.7381944444444444 | 0 |
| 0.7388888888888889 | 0 |
| 0.7395833333333334 | 0 |
| 0.7402777777777777 | 0 |
| 0.7409722222222223 | 0 |
| 0.7416666666666667 | 0 |
| 0.7423611111111111 | 0 |
| 0.7430555555555555 | 0 |
| 0.74375 | 0 |
| 0.7444444444444445 | 0 |
| 0.7451388888888889 | 0 |
| 0.7458333333333332 | 0 |
| 0.7465277777777778 | 0 |
| 0.7472222222222222 | 0 |
| 0.7479166666666667 | 0 |
| 0.748611111111111 | 0 |
| 0.7493055555555556 | 0 |
| 0.75 | 0 |
| 0.7506944444444444 | 0 |
| 0.751388888888889 | 0 |
| 0.7520833333333333 | 0 |
| 0.7527777777777778 | 0 |
| 0.7534722222222222 | 0 |
| 0.7541666666666668 | 0 |
| 0.7548611111111111 | 0 |
| 0.7555555555555555 | 0 |
| 0.75625 | 0 |
| 0.7569444444444445 | 0 |
| 0.7576388888888889 | 0 |
| 0.7583333333333333 | 0 |
| 0.7590277777777777 | 0 |
| 0.7597222222222223 | 0 |
| 0.7604166666666666 | 0 |
| 0.7611111111111111 | 0 |
| 0.7618055555555556 | 0 |
| 0.7625000000000001 | 0 |
| 0.7631944444444444 | 0 |
| 0.7638888888888888 | 0 |
| 0.7645833333333334 | 0 |
| 0.7652777777777778 | 0 |
| 0.7659722222222222 | 0 |
| 0.7666666666666666 | 0 |
| 0.7673611111111112 | 0 |
| 0.7680555555555556 | 0 |
| 0.7687499999999999 | 0 |
| 0.7694444444444444 | 0 |
| 0.7701388888888889 | 0 |
| 0.7708333333333334 | 0 |
| 0.7715277777777777 | 0 |
| 0.7722222222222223 | 0 |
| 0.7729166666666667 | 0 |
| 0.7736111111111111 | 0 |
| 0.7743055555555555 | 0 |
| 0.775 | 0 |
| 0.7756944444444445 | 0 |
| 0.7763888888888889 | 0 |
| 0.7770833333333332 | 0 |
| 0.7777777777777778 | 0 |
| 0.7784722222222222 | 0 |
| 0.7791666666666667 | 0 |
| 0.779861111111111 | 0 |
| 0.7805555555555556 | 0 |
| 0.78125 | 0 |
| 0.7819444444444444 | 0 |
| 0.782638888888889 | 0 |
| 0.7833333333333333 | 0 |
| 0.7840277777777778 | 0 |
| 0.7847222222222222 | 0 |
| 0.7854166666666668 | 0 |
| 0.7861111111111111 | 0 |
| 0.7868055555555555 | 0 |
| 0.7875 | 0 |
| 0.7881944444444445 | 0 |
| 0.7888888888888889 | 0 |
| 0.7895833333333333 | 0 |
| 0.7902777777777777 | 0 |
| 0.7909722222222223 | 0 |
| 0.7916666666666666 | 0 |
| 0.7923611111111111 | 0 |
| 0.7930555555555556 | 0 |
| 0.7937500000000001 | 0 |
| 0.7944444444444444 | 0 |
| 0.7951388888888888 | 0 |
| 0.7958333333333334 | 0 |
| 0.7965277777777778 | 0 |
| 0.7972222222222222 | 0 |
| 0.7979166666666666 | 0 |
| 0.7986111111111112 | 0 |
| 0.7993055555555556 | 0 |
| 0.7999999999999999 | 0 |
| 0.8006944444444444 | 0 |
| 0.8013888888888889 | 0 |
| 0.8020833333333334 | 0 |
| 0.8027777777777777 | 0 |
| 0.8034722222222223 | 0 |
| 0.8041666666666667 | 0 |
| 0.8048611111111111 | 0 |
| 0.8055555555555555 | 0 |
| 0.80625 | 0 |
| 0.8069444444444445 | 0 |
| 0.8076388888888889 | 0 |
| 0.8083333333333332 | 0 |
| 0.8090277777777778 | 0 |
| 0.8097222222222222 | 0 |
| 0.8104166666666667 | 0 |
| 0.811111111111111 | 0 |
| 0.8118055555555556 | 0 |
| 0.8125 | 0 |
| 0.8131944444444444 | 0 |
| 0.813888888888889 | 0 |
| 0.8145833333333333 | 0 |
| 0.8152777777777778 | 0 |
| 0.8159722222222222 | 0 |
| 0.8166666666666668 | 0 |
| 0.8173611111111111 | 0 |
| 0.8180555555555555 | 0 |
| 0.81875 | 0 |
| 0.8194444444444445 | 0 |
| 0.8201388888888889 | 0 |
| 0.8208333333333333 | 0 |
| 0.8215277777777777 | 0 |
| 0.8222222222222223 | 0 |
| 0.8229166666666666 | 0 |
| 0.8236111111111111 | 0 |
| 0.8243055555555556 | 0 |
| 0.8250000000000001 | 0 |
| 0.8256944444444444 | 0 |
| 0.8263888888888888 | 0 |
| 0.8270833333333334 | 0 |
| 0.8277777777777778 | 0 |
| 0.8284722222222222 | 0 |
| 0.8291666666666666 | 0 |
| 0.8298611111111112 | 0 |
| 0.8305555555555556 | 0 |
| 0.8312499999999999 | 0 |
| 0.8319444444444444 | 0 |
| 0.8326388888888889 | 0 |
| 0.8333333333333334 | 0 |
| 0.8340277777777777 | 0 |
| 0.8347222222222223 | 0 |
| 0.8354166666666667 | 0 |
| 0.8361111111111111 | 0 |
| 0.8368055555555555 | 0 |
| 0.8375 | 0 |
| 0.8381944444444445 | 0 |
| 0.8388888888888889 | 0 |
| 0.8395833333333332 | 0 |
| 0.8402777777777778 | 0 |
| 0.8409722222222222 | 0 |
| 0.8416666666666667 | 0 |
| 0.842361111111111 | 0 |
| 0.8430555555555556 | 0 |
| 0.84375 | 0 |
| 0.8444444444444444 | 0 |
| 0.845138888888889 | 0 |
| 0.8458333333333333 | 0 |
| 0.8465277777777778 | 0 |
| 0.8472222222222222 | 0 |
| 0.8479166666666668 | 0 |
| 0.8486111111111111 | 0 |
| 0.8493055555555555 | 0 |
| 0.85 | 0 |
| 0.8506944444444445 | 0 |
| 0.8513888888888889 | 0 |
| 0.8520833333333333 | 0 |
| 0.8527777777777777 | 0 |
| 0.8534722222222223 | 0 |
| 0.8541666666666666 | 0 |
| 0.8548611111111111 | 0 |
| 0.8555555555555556 | 0 |
| 0.8562500000000001 | 0 |
| 0.8569444444444444 | 0 |
| 0.8576388888888888 | 0 |
| 0.8583333333333334 | 0 |
| 0.8590277777777778 | 0 |
| 0.8597222222222222 | 0 |
| 0.8604166666666666 | 0 |
| 0.8611111111111112 | 0 |
| 0.8618055555555556 | 0 |
| 0.8624999999999999 | 0 |
| 0.8631944444444444 | 0 |
| 0.8638888888888889 | 0 |
| 0.8645833333333334 | 0 |
| 0.8652777777777777 | 0 |
| 0.8659722222222223 | 0 |
| 0.8666666666666667 | 0 |
| 0.8673611111111111 | 0 |
| 0.8680555555555555 | 0 |
| 0.86875 | 0 |
| 0.8694444444444445 | 0 |
| 0.8701388888888889 | 0 |
| 0.8708333333333332 | 0 |
| 0.8715277777777778 | 0 |
| 0.8722222222222222 | 0 |
| 0.8729166666666667 | 0 |
| 0.873611111111111 | 0 |
| 0.8743055555555556 | 0 |
| 0.875 | 0 |
| 0.8756944444444444 | 0 |
| 0.876388888888889 | 0 |
| 0.8770833333333333 | 0 |
| 0.8777777777777778 | 0 |
| 0.8784722222222222 | 0 |
| 0.8791666666666668 | 0 |
| 0.8798611111111111 | 0 |
| 0.8805555555555555 | 0 |
| 0.88125 | 0 |
| 0.8819444444444445 | 0 |
| 0.8826388888888889 | 0 |
| 0.8833333333333333 | 0 |
| 0.8840277777777777 | 0 |
| 0.8847222222222223 | 0 |
| 0.8854166666666666 | 0 |
| 0.8861111111111111 | 0 |
| 0.8868055555555556 | 0 |
| 0.8875000000000001 | 0 |
| 0.8881944444444444 | 0 |
| 0.8888888888888888 | 0 |
| 0.8895833333333334 | 0 |
| 0.8902777777777778 | 0 |
| 0.8909722222222222 | 0 |
| 0.8916666666666666 | 0 |
| 0.8923611111111112 | 0 |
| 0.8930555555555556 | 0 |
| 0.8937499999999999 | 0 |
| 0.8944444444444444 | 0 |
| 0.8951388888888889 | 0 |
| 0.8958333333333334 | 0 |
| 0.8965277777777777 | 0 |
| 0.8972222222222223 | 0 |
| 0.8979166666666667 | 0 |
| 0.8986111111111111 | 0 |
| 0.8993055555555555 | 0 |
| 0.9 | 0 |
| 0.9006944444444445 | 0 |
| 0.9013888888888889 | 0 |
| 0.9020833333333332 | 0 |
| 0.9027777777777778 | 0 |
| 0.9034722222222222 | 0 |
| 0.9041666666666667 | 0 |
| 0.904861111111111 | 0 |
| 0.9055555555555556 | 0 |
| 0.90625 | 0 |
| 0.9069444444444444 | 0 |
| 0.907638888888889 | 0 |
| 0.9083333333333333 | 0 |
| 0.9090277777777778 | 0 |
| 0.9097222222222222 | 0 |
| 0.9104166666666668 | 0 |
| 0.9111111111111111 | 0 |
| 0.9118055555555555 | 0 |
| 0.9125 | 0 |
| 0.9131944444444445 | 0 |
| 0.9138888888888889 | 0 |
| 0.9145833333333333 | 0 |
| 0.9152777777777777 | 0 |
| 0.9159722222222223 | 0 |
| 0.9166666666666666 | 0 |
| 0.9173611111111111 | 0 |
| 0.9180555555555556 | 0 |
| 0.9187500000000001 | 0 |
| 0.9194444444444444 | 0 |
| 0.9201388888888888 | 0 |
| 0.9208333333333334 | 0 |
| 0.9215277777777778 | 0 |
| 0.9222222222222222 | 0 |
| 0.9229166666666666 | 0 |
| 0.9236111111111112 | 0 |
| 0.9243055555555556 | 0 |
| 0.9249999999999999 | 0 |
| 0.9256944444444444 | 0 |
| 0.9263888888888889 | 0 |
| 0.9270833333333334 | 0 |
| 0.9277777777777777 | 0 |
| 0.9284722222222223 | 0 |
| 0.9291666666666667 | 0 |
| 0.9298611111111111 | 0 |
| 0.9305555555555555 | 0 |
| 0.93125 | 0 |
| 0.9319444444444445 | 0 |
| 0.9326388888888889 | 0 |
| 0.9333333333333332 | 0 |
| 0.9340277777777778 | 0 |
| 0.9347222222222222 | 0 |
| 0.9354166666666667 | 0 |
| 0.936111111111111 | 0 |
| 0.9368055555555556 | 0 |
| 0.9375 | 0 |
| 0.9381944444444444 | 0 |
| 0.938888888888889 | 0 |
| 0.9395833333333333 | 0 |
| 0.9402777777777778 | 0 |
| 0.9409722222222222 | 0 |
| 0.9416666666666668 | 0 |
| 0.9423611111111111 | 0 |
| 0.9430555555555555 | 0 |
| 0.94375 | 0 |
| 0.9444444444444445 | 0 |
| 0.9451388888888889 | 0 |
| 0.9458333333333333 | 0 |
| 0.9465277777777777 | 0 |
| 0.9472222222222223 | 0 |
| 0.9479166666666666 | 0 |
| 0.9486111111111111 | 0 |
| 0.9493055555555556 | 0 |
| 0.9500000000000001 | 0 |
| 0.9506944444444444 | 0 |
| 0.9513888888888888 | 0 |
| 0.9520833333333334 | 0 |
| 0.9527777777777778 | 0 |
| 0.9534722222222222 | 0 |
| 0.9541666666666666 | 0 |
| 0.9548611111111112 | 0 |
| 0.9555555555555556 | 0 |
| 0.9562499999999999 | 0 |
| 0.9569444444444444 | 0 |
| 0.9576388888888889 | 0 |
| 0.9583333333333334 | 0 |
| 0.9590277777777777 | 0 |
| 0.9597222222222223 | 0 |
| 0.9604166666666667 | 0 |
| 0.9611111111111111 | 0 |
| 0.9618055555555555 | 0 |
| 0.9625 | 0 |
| 0.9631944444444445 | 0 |
| 0.9638888888888889 | 0 |
| 0.9645833333333332 | 0 |
| 0.9652777777777778 | 0 |
| 0.9659722222222222 | 0 |
| 0.9666666666666667 | 0 |
| 0.967361111111111 | 0 |
| 0.9680555555555556 | 0 |
| 0.96875 | 0 |
| 0.9694444444444444 | 0 |
| 0.970138888888889 | 0 |
| 0.9708333333333333 | 0 |
| 0.9715277777777778 | 0 |
| 0.9722222222222222 | 0 |
| 0.9729166666666668 | 0 |
| 0.9736111111111111 | 0 |
| 0.9743055555555555 | 0 |
| 0.975 | 0 |
| 0.9756944444444445 | 0 |
| 0.9763888888888889 | 0 |
| 0.9770833333333333 | 0 |
| 0.9777777777777777 | 0 |
| 0.9784722222222223 | 0 |
| 0.9791666666666666 | 0 |
| 0.9798611111111111 | 0 |
| 0.9805555555555556 | 0 |
| 0.9812500000000001 | 0 |
| 0.9819444444444444 | 0 |
| 0.9826388888888888 | 0 |
| 0.9833333333333334 | 0 |
| 0.9840277777777778 | 0 |
| 0.9847222222222222 | 0 |
| 0.9854166666666666 | 0 |
| 0.9861111111111112 | 0 |
| 0.9868055555555556 | 0 |
| 0.9874999999999999 | 0 |
| 0.9881944444444444 | 0 |
| 0.9888888888888889 | 0 |
| 0.9895833333333334 | 0 |
| 0.9902777777777777 | 0 |
| 0.9909722222222223 | 0 |
| 0.9916666666666667 | 0 |
| 0.9923611111111111 | 0 |
| 0.9930555555555555 | 0 |
| 0.99375 | 0 |
| 0.9944444444444445 | 0 |
| 0.9951388888888889 | 0 |
| 0.9958333333333332 | 0 |
| 0.9965277777777778 | 0 |
| 0.9972222222222222 | 0 |
| 0.9979166666666667 | 0 |
| 0.998611111111111 | 0 |
| 0.9993055555555556 | 0 |